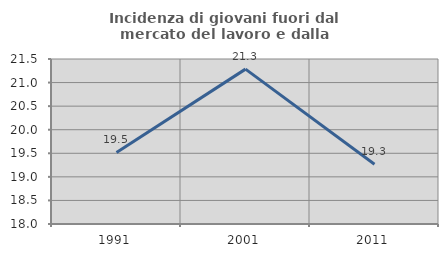
| Category | Incidenza di giovani fuori dal mercato del lavoro e dalla formazione  |
|---|---|
| 1991.0 | 19.519 |
| 2001.0 | 21.285 |
| 2011.0 | 19.266 |